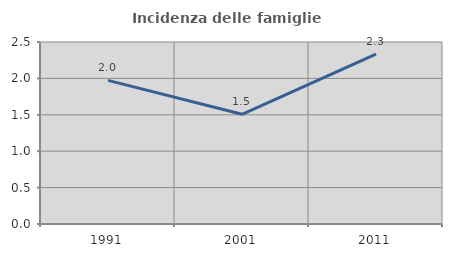
| Category | Incidenza delle famiglie numerose |
|---|---|
| 1991.0 | 1.973 |
| 2001.0 | 1.507 |
| 2011.0 | 2.334 |